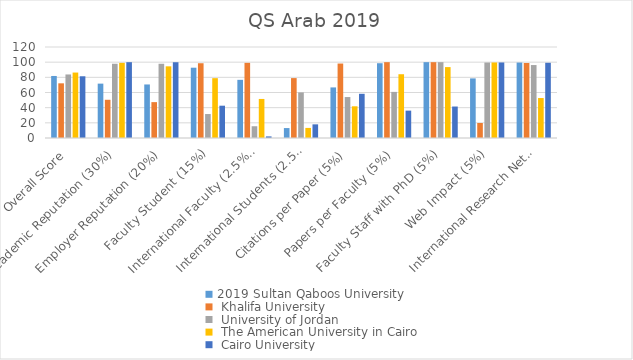
| Category | 2019 |
|---|---|
| Overall Score | 81.4 |
| Academic Reputation (30%) | 100 |
| Employer Reputation (20%) | 99.9 |
| Faculty Student (15%) | 42.6 |
| International Faculty (2.5%)  | 2.1 |
| International Students (2.5%) | 18 |
| Citations per Paper (5%) | 58.3 |
| Papers per Faculty (5%) | 36.1 |
| Faculty Staff with PhD (5%) | 41.5 |
| Web Impact (5%) | 99.6 |
| International Research Network (10%) | 99.2 |